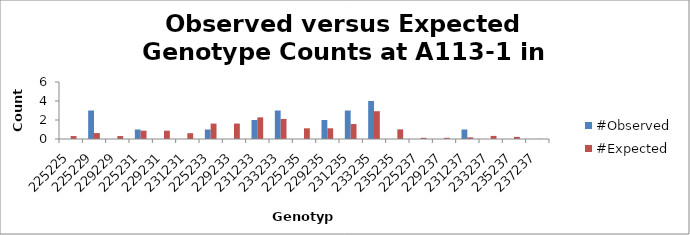
| Category | #Observed | #Expected |
|---|---|---|
| 225225.0 | 0 | 0.312 |
| 225229.0 | 3 | 0.625 |
| 229229.0 | 0 | 0.312 |
| 225231.0 | 1 | 0.875 |
| 229231.0 | 0 | 0.875 |
| 231231.0 | 0 | 0.612 |
| 225233.0 | 1 | 1.625 |
| 229233.0 | 0 | 1.625 |
| 231233.0 | 2 | 2.275 |
| 233233.0 | 3 | 2.112 |
| 225235.0 | 0 | 1.125 |
| 229235.0 | 2 | 1.125 |
| 231235.0 | 3 | 1.575 |
| 233235.0 | 4 | 2.925 |
| 235235.0 | 0 | 1.012 |
| 225237.0 | 0 | 0.125 |
| 229237.0 | 0 | 0.125 |
| 231237.0 | 1 | 0.175 |
| 233237.0 | 0 | 0.325 |
| 235237.0 | 0 | 0.225 |
| 237237.0 | 0 | 0.012 |